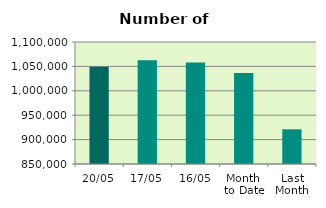
| Category | Series 0 |
|---|---|
| 20/05 | 1049226 |
| 17/05 | 1062756 |
| 16/05 | 1058026 |
| Month 
to Date | 1036529.231 |
| Last
Month | 921109.3 |